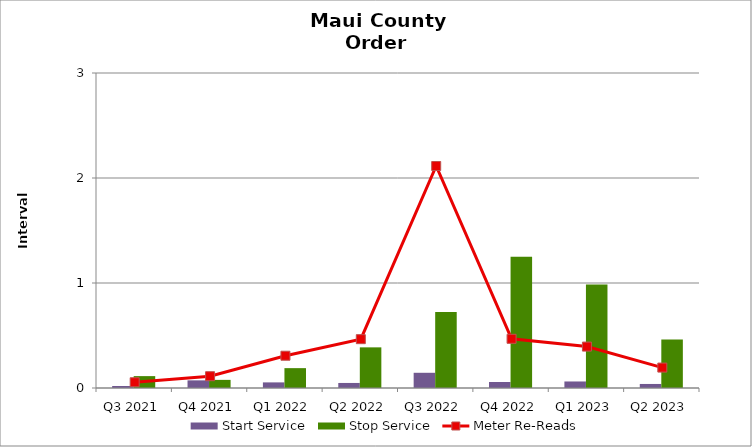
| Category | Start Service | Stop Service |
|---|---|---|
| Q3 2021 | 0.019 | 0.113 |
| Q4 2021 | 0.073 | 0.077 |
| Q1 2022 | 0.053 | 0.189 |
| Q2 2022 | 0.048 | 0.387 |
| Q3 2022 | 0.145 | 0.724 |
| Q4 2022 | 0.057 | 1.251 |
| Q1 2023 | 0.062 | 0.985 |
| Q2 2023 | 0.038 | 0.462 |